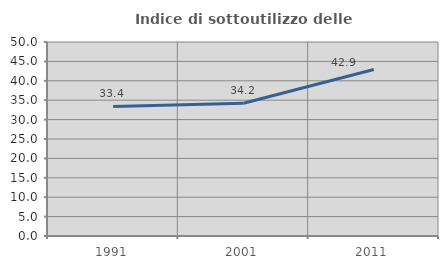
| Category | Indice di sottoutilizzo delle abitazioni  |
|---|---|
| 1991.0 | 33.382 |
| 2001.0 | 34.214 |
| 2011.0 | 42.912 |